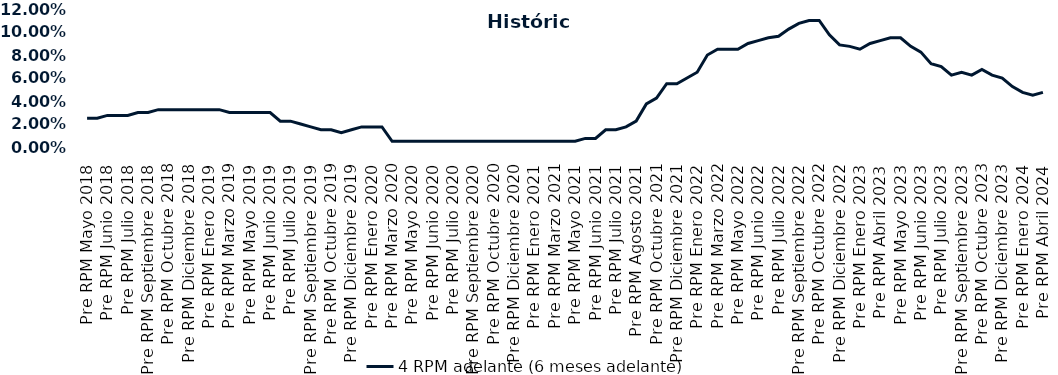
| Category | 4 RPM adelante (6 meses adelante) |
|---|---|
| Pre RPM Mayo 2018 | 0.025 |
| Post RPM Mayo 2018 | 0.025 |
| Pre RPM Junio 2018 | 0.028 |
| Post RPM Junio 2018 | 0.028 |
| Pre RPM Julio 2018 | 0.028 |
| Post RPM Julio 2018 | 0.03 |
| Pre RPM Septiembre 2018 | 0.03 |
| Post RPM Septiembre 2018 | 0.032 |
| Pre RPM Octubre 2018 | 0.032 |
| Post RPM Octubre 2018 | 0.032 |
| Pre RPM Diciembre 2018 | 0.032 |
| Post RPM Diciembre 2018 | 0.032 |
| Pre RPM Enero 2019 | 0.032 |
| Post RPM Enero 2019 | 0.032 |
| Pre RPM Marzo 2019 | 0.03 |
| Post RPM Marzo 2019 | 0.03 |
| Pre RPM Mayo 2019 | 0.03 |
| Post RPM Mayo 2019 | 0.03 |
| Pre RPM Junio 2019 | 0.03 |
| Post RPM Junio 2019 | 0.022 |
| Pre RPM Julio 2019 | 0.022 |
| Post RPM Julio 2019 | 0.02 |
| Pre RPM Septiembre 2019 | 0.018 |
| Post RPM Septiembre 2019 | 0.015 |
| Pre RPM Octubre 2019 | 0.015 |
| Post RPM Octubre 2019 | 0.012 |
| Pre RPM Diciembre 2019 | 0.015 |
| Post RPM Diciembre 2019 | 0.018 |
| Pre RPM Enero 2020 | 0.018 |
| Post RPM Enero 2020 | 0.018 |
| Pre RPM Marzo 2020 | 0.005 |
| Post RPM Marzo 2020 | 0.005 |
| Pre RPM Mayo 2020 | 0.005 |
| Post RPM Mayo 2020 | 0.005 |
| Pre RPM Junio 2020 | 0.005 |
| Post RPM Junio 2020 | 0.005 |
| Pre RPM Julio 2020 | 0.005 |
| Post RPM Julio 2020 | 0.005 |
| Pre RPM Septiembre 2020 | 0.005 |
| Post RPM Septiembre 2020 | 0.005 |
| Pre RPM Octubre 2020 | 0.005 |
| Post RPM Octubre 2020 | 0.005 |
| Pre RPM Diciembre 2020 | 0.005 |
| Post RPM Diciembre 2020 | 0.005 |
| Pre RPM Enero 2021 | 0.005 |
| Post RPM Enero 2021 | 0.005 |
| Pre RPM Marzo 2021 | 0.005 |
| Post RPM Marzo 2021 | 0.005 |
| Pre RPM Mayo 2021 | 0.005 |
| Post RPM Mayo 2021 | 0.008 |
| Pre RPM Junio 2021 | 0.008 |
| Post RPM Junio 2021 | 0.015 |
| Pre RPM Julio 2021 | 0.015 |
| Post RPM Julio 2021 | 0.018 |
| Pre RPM Agosto 2021 | 0.022 |
| Post RPM Agosto 2021 | 0.038 |
| Pre RPM Octubre 2021 | 0.042 |
| Post RPM Octubre 2021 | 0.055 |
| Pre RPM Diciembre 2021 | 0.055 |
| Post RPM Diciembre 2021 | 0.06 |
| Pre RPM Enero 2022 | 0.065 |
| Post RPM Enero 2022 | 0.08 |
| Pre RPM Marzo 2022 | 0.085 |
| Post RPM Marzo 2022 | 0.085 |
| Pre RPM Mayo 2022 | 0.085 |
| Post RPM Mayo 2022 | 0.09 |
| Pre RPM Junio 2022 | 0.092 |
| Post RPM Junio 2022 | 0.095 |
| Pre RPM Julio 2022 | 0.096 |
| Post RPM Julio 2022 | 0.102 |
| Pre RPM Septiembre 2022 | 0.108 |
| Post RPM Septiembre 2022 | 0.11 |
| Pre RPM Octubre 2022 | 0.11 |
| Post RPM Octubre 2022 | 0.098 |
| Pre RPM Diciembre 2022 | 0.089 |
| Post RPM Diciembre 2022 | 0.088 |
| Pre RPM Enero 2023 | 0.085 |
| Post RPM Enero 2023 | 0.09 |
| Pre RPM Abril 2023 | 0.092 |
| Post RPM Abril 2023 | 0.095 |
| Pre RPM Mayo 2023 | 0.095 |
| Post RPM Mayo 2023 | 0.088 |
| Pre RPM Junio 2023 | 0.082 |
| Post RPM Junio 2023 | 0.072 |
| Pre RPM Julio 2023 | 0.07 |
| Post RPM Julio 2023 | 0.062 |
| Pre RPM Septiembre 2023 | 0.065 |
| Post RPM Septiembre 2023 | 0.062 |
| Pre RPM Octubre 2023 | 0.068 |
| Post RPM Octubre 2023 | 0.062 |
| Pre RPM Diciembre 2023 | 0.06 |
| Post RPM Diciembre 2023 | 0.052 |
| Pre RPM Enero 2024 | 0.048 |
| Post RPM Enero 2024 | 0.045 |
| Pre RPM Abril 2024 | 0.048 |